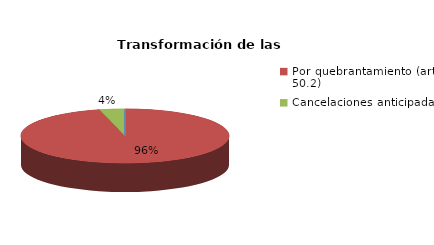
| Category | Series 0 |
|---|---|
| Reducciones y sustituciones (arts. 13 y 51) | 0 |
| Por quebrantamiento (art. 50.2) | 49 |
| Cancelaciones anticipadas | 2 |
| Traslado a Centros Penitenciarios | 0 |
| Conversión internamientos en cerrados (art. 51.2) | 0 |